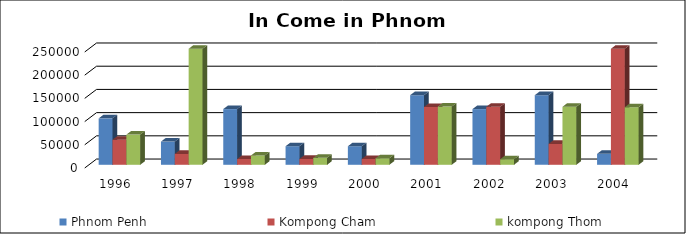
| Category | Phnom Penh | Kompong Cham | kompong Thom |
|---|---|---|---|
| 1996.0 | 100000 | 54000 | 65000 |
| 1997.0 | 50000 | 23500 | 250000 |
| 1998.0 | 120000 | 12400 | 20000 |
| 1999.0 | 40000 | 12587 | 15000 |
| 2000.0 | 40000 | 12500 | 14000 |
| 2001.0 | 150000 | 124580 | 125400 |
| 2002.0 | 120000 | 125000 | 12000 |
| 2003.0 | 150000 | 45000 | 125000 |
| 2004.0 | 23600 | 250000 | 124000 |